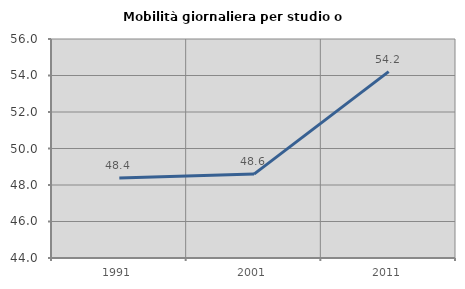
| Category | Mobilità giornaliera per studio o lavoro |
|---|---|
| 1991.0 | 48.387 |
| 2001.0 | 48.597 |
| 2011.0 | 54.213 |